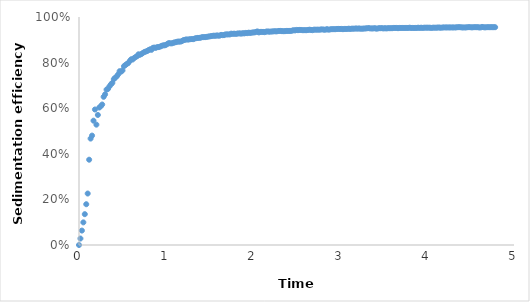
| Category | Series 0 |
|---|---|
| 0.0 | 0 |
| 0.016666666666666666 | 0.028 |
| 0.03333333333333333 | 0.063 |
| 0.05 | 0.099 |
| 0.06666666666666667 | 0.135 |
| 0.08333333333333333 | 0.179 |
| 0.1 | 0.226 |
| 0.11666666666666667 | 0.374 |
| 0.13333333333333333 | 0.467 |
| 0.15 | 0.48 |
| 0.16666666666666666 | 0.545 |
| 0.18333333333333332 | 0.594 |
| 0.2 | 0.528 |
| 0.21666666666666667 | 0.57 |
| 0.23333333333333334 | 0.603 |
| 0.25 | 0.609 |
| 0.26666666666666666 | 0.616 |
| 0.2833333333333333 | 0.65 |
| 0.3 | 0.661 |
| 0.31666666666666665 | 0.682 |
| 0.3333333333333333 | 0.685 |
| 0.35 | 0.696 |
| 0.36666666666666664 | 0.704 |
| 0.38333333333333336 | 0.711 |
| 0.4 | 0.727 |
| 0.4166666666666667 | 0.734 |
| 0.43333333333333335 | 0.739 |
| 0.45 | 0.748 |
| 0.4666666666666667 | 0.762 |
| 0.48333333333333334 | 0.76 |
| 0.5 | 0.766 |
| 0.5166666666666667 | 0.784 |
| 0.5333333333333333 | 0.79 |
| 0.55 | 0.794 |
| 0.5666666666666667 | 0.798 |
| 0.5833333333333334 | 0.807 |
| 0.6 | 0.815 |
| 0.6166666666666667 | 0.814 |
| 0.6333333333333333 | 0.82 |
| 0.65 | 0.824 |
| 0.6666666666666666 | 0.828 |
| 0.6833333333333333 | 0.836 |
| 0.7 | 0.834 |
| 0.7166666666666667 | 0.838 |
| 0.7333333333333333 | 0.842 |
| 0.75 | 0.846 |
| 0.7666666666666667 | 0.848 |
| 0.7833333333333333 | 0.851 |
| 0.8 | 0.855 |
| 0.8166666666666667 | 0.858 |
| 0.8333333333333334 | 0.856 |
| 0.85 | 0.865 |
| 0.8666666666666667 | 0.866 |
| 0.8833333333333333 | 0.865 |
| 0.9 | 0.868 |
| 0.9166666666666666 | 0.868 |
| 0.9333333333333333 | 0.87 |
| 0.95 | 0.874 |
| 0.9666666666666667 | 0.876 |
| 0.9833333333333333 | 0.876 |
| 1.0 | 0.878 |
| 1.0166666666666666 | 0.882 |
| 1.0333333333333334 | 0.885 |
| 1.05 | 0.884 |
| 1.0666666666666667 | 0.884 |
| 1.0833333333333333 | 0.887 |
| 1.1 | 0.889 |
| 1.1166666666666667 | 0.89 |
| 1.1333333333333333 | 0.892 |
| 1.15 | 0.892 |
| 1.1666666666666667 | 0.892 |
| 1.1833333333333333 | 0.894 |
| 1.2 | 0.899 |
| 1.2166666666666666 | 0.9 |
| 1.2333333333333334 | 0.902 |
| 1.25 | 0.901 |
| 1.2666666666666666 | 0.902 |
| 1.2833333333333334 | 0.903 |
| 1.3 | 0.903 |
| 1.3166666666666667 | 0.903 |
| 1.3333333333333333 | 0.906 |
| 1.35 | 0.907 |
| 1.3666666666666667 | 0.908 |
| 1.3833333333333333 | 0.908 |
| 1.4 | 0.909 |
| 1.4166666666666667 | 0.912 |
| 1.4333333333333333 | 0.912 |
| 1.45 | 0.912 |
| 1.4666666666666666 | 0.913 |
| 1.4833333333333334 | 0.914 |
| 1.5 | 0.915 |
| 1.5166666666666666 | 0.916 |
| 1.5333333333333334 | 0.917 |
| 1.55 | 0.918 |
| 1.5666666666666667 | 0.917 |
| 1.5833333333333333 | 0.919 |
| 1.6 | 0.918 |
| 1.6166666666666667 | 0.918 |
| 1.6333333333333333 | 0.921 |
| 1.65 | 0.92 |
| 1.6666666666666667 | 0.92 |
| 1.6833333333333333 | 0.924 |
| 1.7 | 0.924 |
| 1.7166666666666666 | 0.924 |
| 1.7333333333333334 | 0.924 |
| 1.75 | 0.927 |
| 1.7666666666666666 | 0.926 |
| 1.7833333333333334 | 0.927 |
| 1.8 | 0.926 |
| 1.8166666666666667 | 0.927 |
| 1.8333333333333333 | 0.928 |
| 1.85 | 0.928 |
| 1.8666666666666667 | 0.927 |
| 1.8833333333333333 | 0.929 |
| 1.9 | 0.928 |
| 1.9166666666666667 | 0.93 |
| 1.9333333333333333 | 0.929 |
| 1.95 | 0.931 |
| 1.9666666666666666 | 0.93 |
| 1.9833333333333334 | 0.931 |
| 2.0 | 0.932 |
| 2.0166666666666666 | 0.932 |
| 2.033333333333333 | 0.935 |
| 2.05 | 0.937 |
| 2.066666666666667 | 0.932 |
| 2.0833333333333335 | 0.935 |
| 2.1 | 0.935 |
| 2.1166666666666667 | 0.935 |
| 2.1333333333333333 | 0.933 |
| 2.15 | 0.936 |
| 2.1666666666666665 | 0.937 |
| 2.183333333333333 | 0.936 |
| 2.2 | 0.936 |
| 2.216666666666667 | 0.937 |
| 2.2333333333333334 | 0.937 |
| 2.25 | 0.938 |
| 2.2666666666666666 | 0.937 |
| 2.283333333333333 | 0.938 |
| 2.3 | 0.939 |
| 2.316666666666667 | 0.939 |
| 2.3333333333333335 | 0.938 |
| 2.35 | 0.938 |
| 2.3666666666666667 | 0.938 |
| 2.3833333333333333 | 0.939 |
| 2.4 | 0.939 |
| 2.4166666666666665 | 0.939 |
| 2.433333333333333 | 0.939 |
| 2.45 | 0.94 |
| 2.466666666666667 | 0.942 |
| 2.4833333333333334 | 0.941 |
| 2.5 | 0.943 |
| 2.5166666666666666 | 0.942 |
| 2.533333333333333 | 0.943 |
| 2.55 | 0.943 |
| 2.566666666666667 | 0.942 |
| 2.5833333333333335 | 0.942 |
| 2.6 | 0.942 |
| 2.6166666666666667 | 0.942 |
| 2.6333333333333333 | 0.943 |
| 2.65 | 0.944 |
| 2.6666666666666665 | 0.943 |
| 2.683333333333333 | 0.942 |
| 2.7 | 0.944 |
| 2.716666666666667 | 0.944 |
| 2.7333333333333334 | 0.944 |
| 2.75 | 0.944 |
| 2.7666666666666666 | 0.944 |
| 2.783333333333333 | 0.945 |
| 2.8 | 0.945 |
| 2.816666666666667 | 0.944 |
| 2.8333333333333335 | 0.944 |
| 2.85 | 0.947 |
| 2.8666666666666667 | 0.944 |
| 2.8833333333333333 | 0.945 |
| 2.9 | 0.947 |
| 2.9166666666666665 | 0.947 |
| 2.933333333333333 | 0.947 |
| 2.95 | 0.947 |
| 2.966666666666667 | 0.948 |
| 2.9833333333333334 | 0.948 |
| 3.0 | 0.948 |
| 3.0166666666666666 | 0.948 |
| 3.033333333333333 | 0.947 |
| 3.05 | 0.948 |
| 3.066666666666667 | 0.948 |
| 3.0833333333333335 | 0.948 |
| 3.1 | 0.949 |
| 3.1166666666666667 | 0.948 |
| 3.1333333333333333 | 0.949 |
| 3.15 | 0.949 |
| 3.1666666666666665 | 0.949 |
| 3.183333333333333 | 0.95 |
| 3.2 | 0.949 |
| 3.216666666666667 | 0.95 |
| 3.2333333333333334 | 0.949 |
| 3.25 | 0.949 |
| 3.2666666666666666 | 0.949 |
| 3.283333333333333 | 0.95 |
| 3.3 | 0.95 |
| 3.316666666666667 | 0.951 |
| 3.3333333333333335 | 0.951 |
| 3.35 | 0.95 |
| 3.3666666666666667 | 0.95 |
| 3.3833333333333333 | 0.95 |
| 3.4 | 0.951 |
| 3.4166666666666665 | 0.949 |
| 3.433333333333333 | 0.95 |
| 3.45 | 0.951 |
| 3.466666666666667 | 0.951 |
| 3.4833333333333334 | 0.951 |
| 3.5 | 0.95 |
| 3.5166666666666666 | 0.951 |
| 3.533333333333333 | 0.95 |
| 3.55 | 0.951 |
| 3.566666666666667 | 0.951 |
| 3.5833333333333335 | 0.951 |
| 3.6 | 0.951 |
| 3.6166666666666667 | 0.952 |
| 3.6333333333333333 | 0.952 |
| 3.65 | 0.952 |
| 3.6666666666666665 | 0.951 |
| 3.683333333333333 | 0.952 |
| 3.7 | 0.952 |
| 3.716666666666667 | 0.952 |
| 3.7333333333333334 | 0.952 |
| 3.75 | 0.952 |
| 3.7666666666666666 | 0.952 |
| 3.783333333333333 | 0.952 |
| 3.8 | 0.953 |
| 3.816666666666667 | 0.952 |
| 3.8333333333333335 | 0.952 |
| 3.85 | 0.952 |
| 3.8666666666666667 | 0.952 |
| 3.8833333333333333 | 0.952 |
| 3.9 | 0.953 |
| 3.9166666666666665 | 0.952 |
| 3.933333333333333 | 0.953 |
| 3.95 | 0.952 |
| 3.966666666666667 | 0.953 |
| 3.9833333333333334 | 0.953 |
| 4.0 | 0.953 |
| 4.016666666666667 | 0.953 |
| 4.033333333333333 | 0.953 |
| 4.05 | 0.952 |
| 4.066666666666666 | 0.953 |
| 4.083333333333333 | 0.953 |
| 4.1 | 0.953 |
| 4.116666666666666 | 0.953 |
| 4.133333333333334 | 0.954 |
| 4.15 | 0.953 |
| 4.166666666666667 | 0.953 |
| 4.183333333333334 | 0.954 |
| 4.2 | 0.954 |
| 4.216666666666667 | 0.954 |
| 4.233333333333333 | 0.954 |
| 4.25 | 0.954 |
| 4.266666666666667 | 0.954 |
| 4.283333333333333 | 0.954 |
| 4.3 | 0.954 |
| 4.316666666666666 | 0.954 |
| 4.333333333333333 | 0.954 |
| 4.35 | 0.955 |
| 4.366666666666666 | 0.955 |
| 4.383333333333334 | 0.955 |
| 4.4 | 0.954 |
| 4.416666666666667 | 0.954 |
| 4.433333333333334 | 0.954 |
| 4.45 | 0.954 |
| 4.466666666666667 | 0.955 |
| 4.483333333333333 | 0.955 |
| 4.5 | 0.955 |
| 4.516666666666667 | 0.954 |
| 4.533333333333333 | 0.955 |
| 4.55 | 0.955 |
| 4.566666666666666 | 0.955 |
| 4.583333333333333 | 0.955 |
| 4.6 | 0.954 |
| 4.616666666666666 | 0.954 |
| 4.633333333333334 | 0.956 |
| 4.65 | 0.955 |
| 4.666666666666667 | 0.954 |
| 4.683333333333334 | 0.955 |
| 4.7 | 0.955 |
| 4.716666666666667 | 0.955 |
| 4.733333333333333 | 0.955 |
| 4.75 | 0.955 |
| 4.766666666666667 | 0.955 |
| 4.783333333333333 | 0.955 |